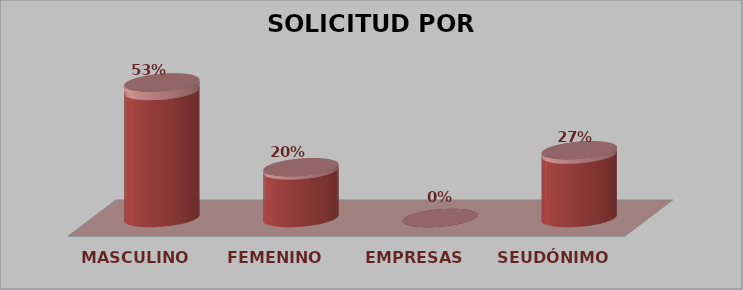
| Category | SOLICITUD POR SEXO | Series 1 |
|---|---|---|
| MASCULINO | 8 | 0.533 |
| FEMENINO | 3 | 0.2 |
| EMPRESAS | 0 | 0 |
| SEUDÓNIMO | 4 | 0.267 |